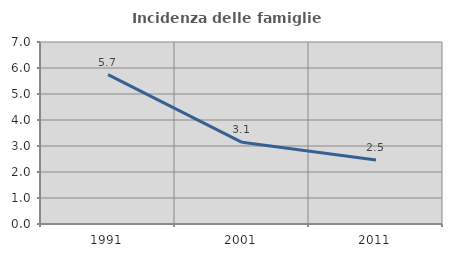
| Category | Incidenza delle famiglie numerose |
|---|---|
| 1991.0 | 5.746 |
| 2001.0 | 3.14 |
| 2011.0 | 2.46 |